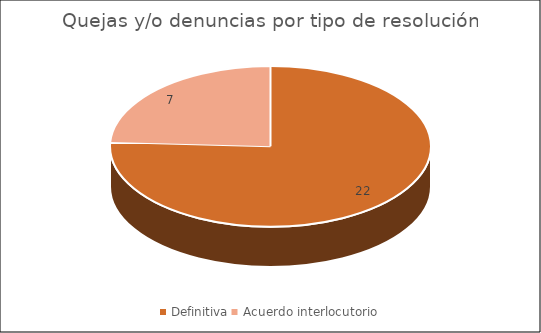
| Category | Quejas y/o denuncias por tipo de resolución |
|---|---|
| Definitiva | 22 |
| Acuerdo interlocutorio | 7 |